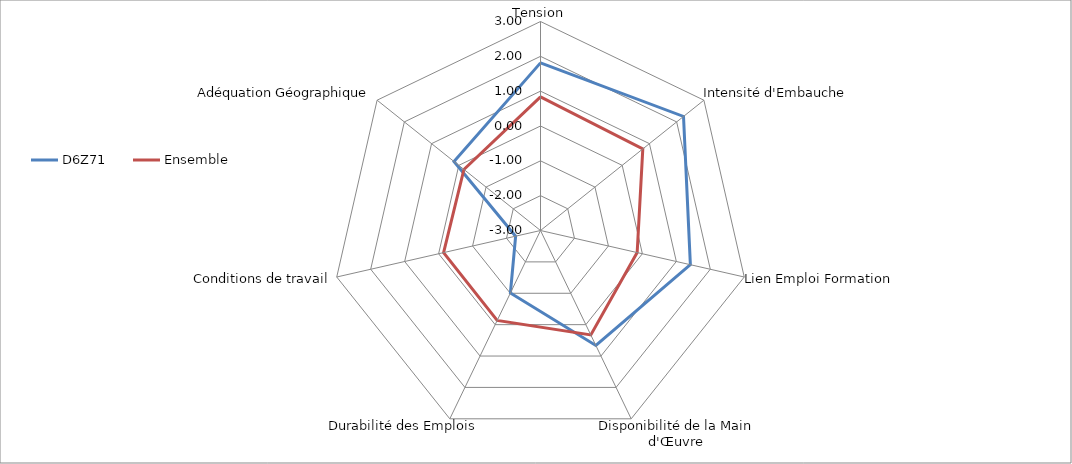
| Category | D6Z71 | Ensemble |
|---|---|---|
| Tension | 1.812 | 0.838 |
| Intensité d'Embauche | 2.251 | 0.756 |
| Lien Emploi Formation | 1.413 | -0.154 |
| Disponibilité de la Main d'Œuvre | 0.664 | 0.329 |
| Durabilité des Emplois | -1.009 | -0.133 |
| Conditions de travail | -2.268 | -0.146 |
| Adéquation Géographique | 0.177 | -0.188 |